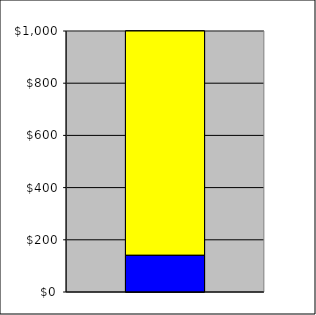
| Category | Series 0 | Series 1 |
|---|---|---|
| 0 | 141.3 | 858.7 |